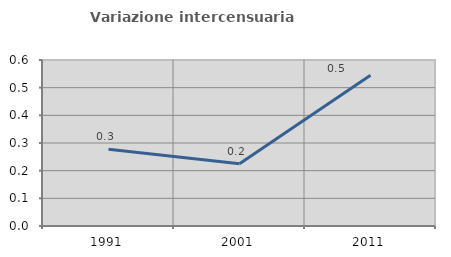
| Category | Variazione intercensuaria annua |
|---|---|
| 1991.0 | 0.278 |
| 2001.0 | 0.225 |
| 2011.0 | 0.545 |